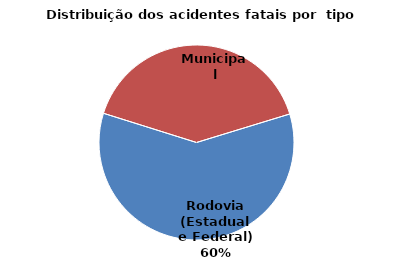
| Category | Series 0 |
|---|---|
| Rodovia (Estadual e Federal) | 1102 |
| Municipal | 748 |